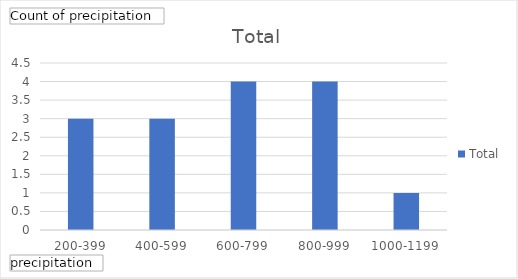
| Category | Total |
|---|---|
| 200-399 | 3 |
| 400-599 | 3 |
| 600-799 | 4 |
| 800-999 | 4 |
| 1000-1199 | 1 |